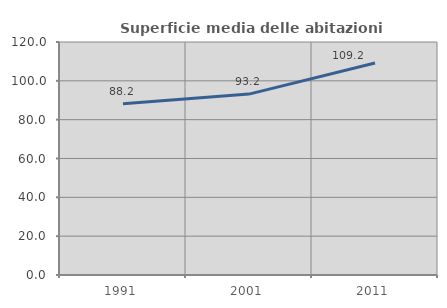
| Category | Superficie media delle abitazioni occupate |
|---|---|
| 1991.0 | 88.202 |
| 2001.0 | 93.158 |
| 2011.0 | 109.153 |